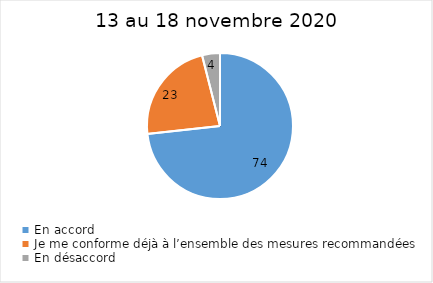
| Category | Series 0 |
|---|---|
| En accord | 74 |
| Je me conforme déjà à l’ensemble des mesures recommandées | 23 |
| En désaccord | 4 |